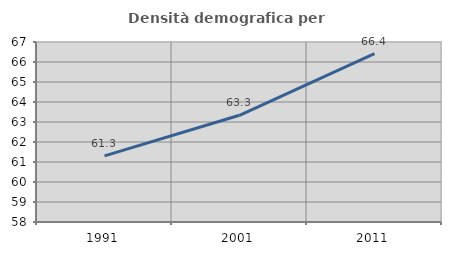
| Category | Densità demografica |
|---|---|
| 1991.0 | 61.305 |
| 2001.0 | 63.336 |
| 2011.0 | 66.42 |